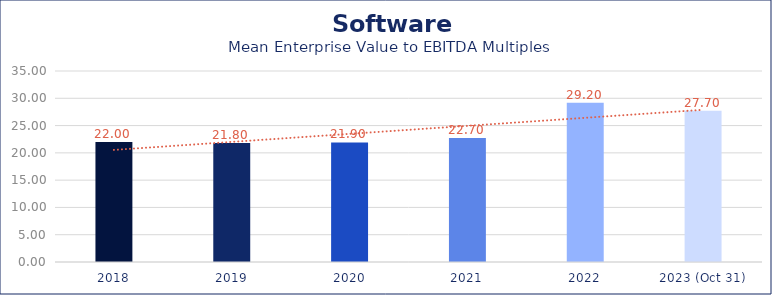
| Category | Software |
|---|---|
| 2018 | 22 |
| 2019 | 21.8 |
| 2020 | 21.9 |
| 2021 | 22.7 |
| 2022 | 29.2 |
| 2023 (Oct 31) | 27.7 |